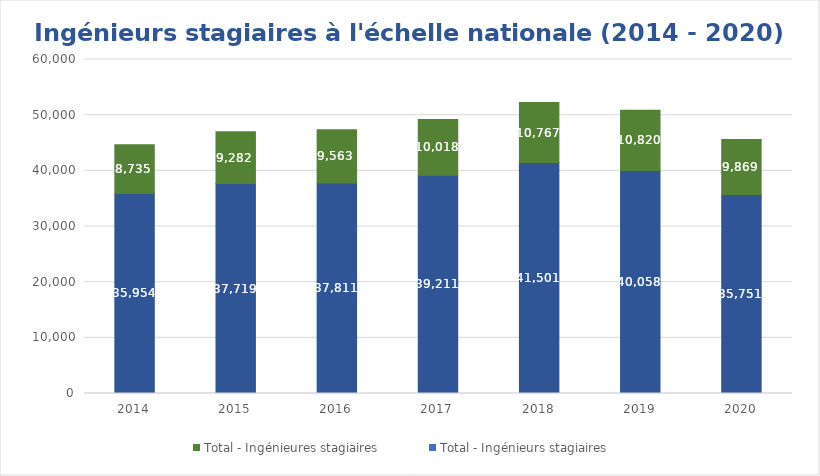
| Category | Total - Ingénieurs stagiaires | Total - Ingénieures stagiaires |
|---|---|---|
| 2014.0 | 35954 | 8735 |
| 2015.0 | 37719 | 9282 |
| 2016.0 | 37811 | 9563 |
| 2017.0 | 39211 | 10018 |
| 2018.0 | 41501 | 10767 |
| 2019.0 | 40058 | 10820 |
| 2020.0 | 35751 | 9869 |